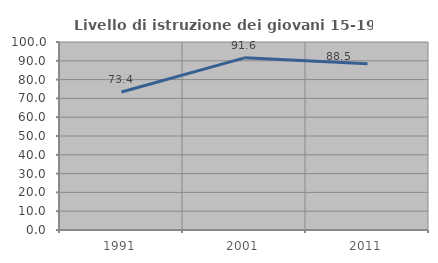
| Category | Livello di istruzione dei giovani 15-19 anni |
|---|---|
| 1991.0 | 73.438 |
| 2001.0 | 91.573 |
| 2011.0 | 88.462 |